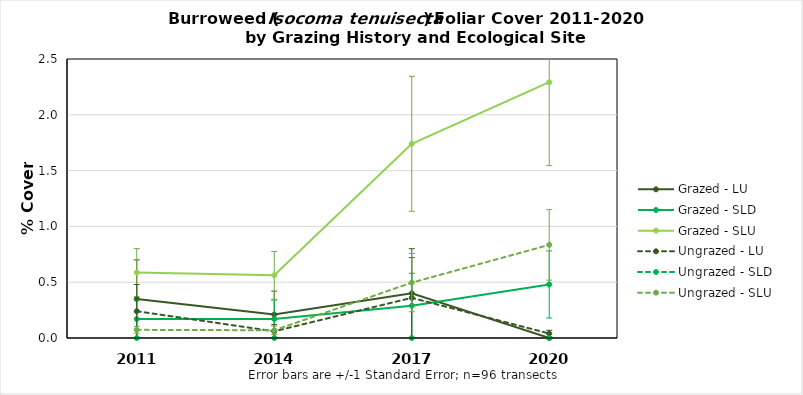
| Category | Grazed - LU | Grazed - SLD | Grazed - SLU | Ungrazed - LU | Ungrazed - SLD | Ungrazed - SLU |
|---|---|---|---|---|---|---|
| 2011.0 | 0.35 | 0.17 | 0.587 | 0.24 | 0 | 0.073 |
| 2014.0 | 0.21 | 0.17 | 0.562 | 0.06 | 0 | 0.069 |
| 2017.0 | 0.4 | 0.29 | 1.74 | 0.36 | 0 | 0.496 |
| 2020.0 | 0 | 0.48 | 2.292 | 0.04 | 0 | 0.835 |